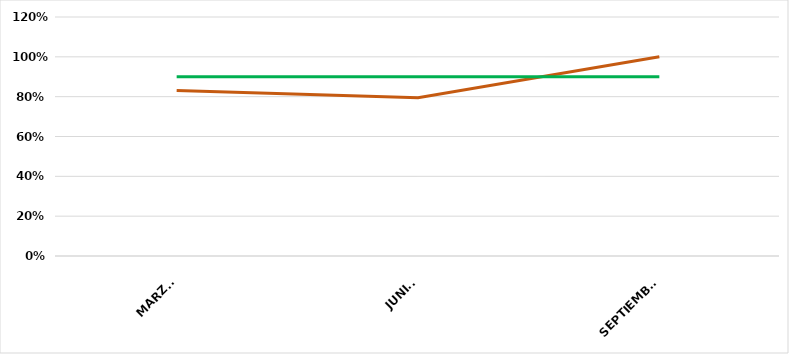
| Category | VALOR  | META PONDERADA |
|---|---|---|
| MARZO | 0.831 | 0.9 |
| JUNIO | 0.795 | 0.9 |
| SEPTIEMBRE | 1 | 0.9 |